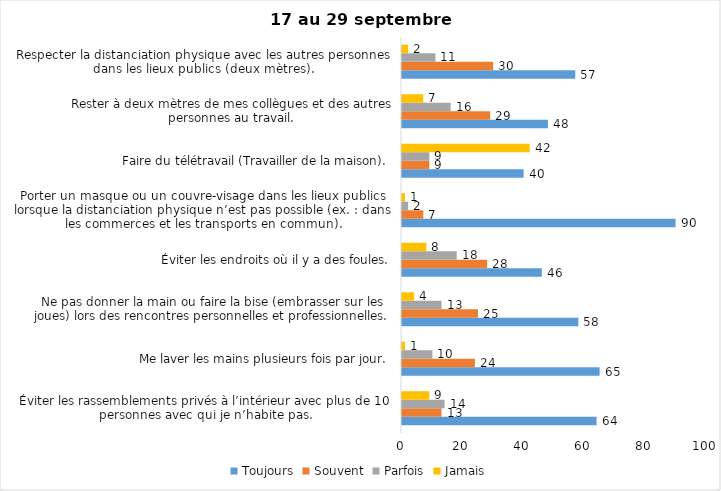
| Category | Toujours | Souvent | Parfois | Jamais |
|---|---|---|---|---|
| Éviter les rassemblements privés à l’intérieur avec plus de 10 personnes avec qui je n’habite pas. | 64 | 13 | 14 | 9 |
| Me laver les mains plusieurs fois par jour. | 65 | 24 | 10 | 1 |
| Ne pas donner la main ou faire la bise (embrasser sur les joues) lors des rencontres personnelles et professionnelles. | 58 | 25 | 13 | 4 |
| Éviter les endroits où il y a des foules. | 46 | 28 | 18 | 8 |
| Porter un masque ou un couvre-visage dans les lieux publics lorsque la distanciation physique n’est pas possible (ex. : dans les commerces et les transports en commun). | 90 | 7 | 2 | 1 |
| Faire du télétravail (Travailler de la maison). | 40 | 9 | 9 | 42 |
| Rester à deux mètres de mes collègues et des autres personnes au travail. | 48 | 29 | 16 | 7 |
| Respecter la distanciation physique avec les autres personnes dans les lieux publics (deux mètres). | 57 | 30 | 11 | 2 |